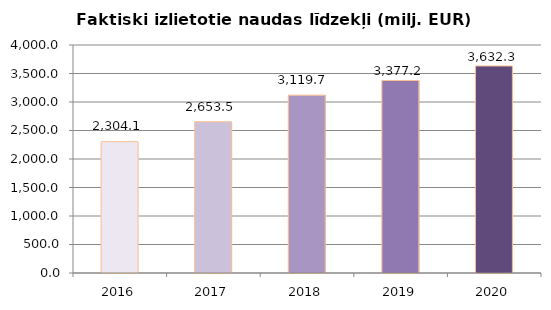
| Category | Faktiski izlietotie naudas līdzekļi (milj. EUR) ar PVN |
|---|---|
| 2016.0 | 2304.104 |
| 2017.0 | 2653.503 |
| 2018.0 | 3119.679 |
| 2019.0 | 3377.208 |
| 2020.0 | 3632.314 |